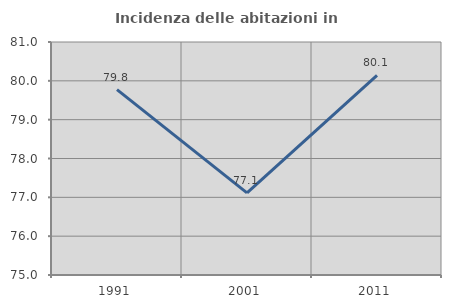
| Category | Incidenza delle abitazioni in proprietà  |
|---|---|
| 1991.0 | 79.774 |
| 2001.0 | 77.116 |
| 2011.0 | 80.143 |